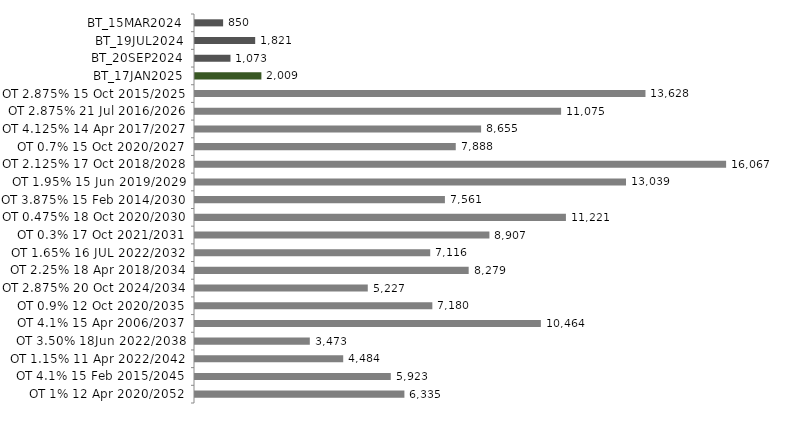
| Category | Series 0 |
|---|---|
| BT_15MAR2024 | 850.496 |
| BT_19JUL2024 | 1820.712 |
| BT_20SEP2024 | 1073.054 |
| BT_17JAN2025 | 2008.562 |
| OT 2.875% 15 Oct 2015/2025 | 13627.591 |
| OT 2.875% 21 Jul 2016/2026 | 11075.196 |
| OT 4.125% 14 Apr 2017/2027 | 8655.046 |
| OT 0.7% 15 Oct 2020/2027 | 7888.456 |
| OT 2.125% 17 Oct 2018/2028 | 16067.387 |
| OT 1.95% 15 Jun 2019/2029 | 13038.995 |
| OT 3.875% 15 Feb 2014/2030 | 7560.513 |
| OT 0.475% 18 Oct 2020/2030 | 11221.218 |
| OT 0.3% 17 Oct 2021/2031 | 8906.526 |
| OT 1.65% 16 JUL 2022/2032 | 7115.935 |
| OT 2.25% 18 Apr 2018/2034 | 8279.46 |
| OT 2.875% 20 Oct 2024/2034 | 5226.86 |
| OT 0.9% 12 Oct 2020/2035 | 7180.159 |
| OT 4.1% 15 Apr 2006/2037 | 10463.59 |
| OT 3.50% 18Jun 2022/2038 | 3473.398 |
| OT 1.15% 11 Apr 2022/2042 | 4483.65 |
| OT 4.1% 15 Feb 2015/2045 | 5922.665 |
| OT 1% 12 Apr 2020/2052 | 6334.867 |